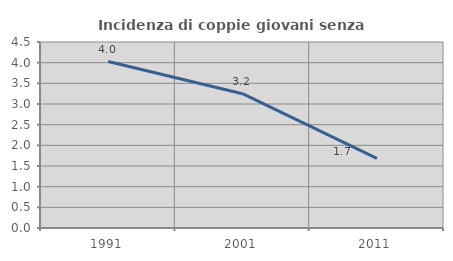
| Category | Incidenza di coppie giovani senza figli |
|---|---|
| 1991.0 | 4.027 |
| 2001.0 | 3.25 |
| 2011.0 | 1.686 |